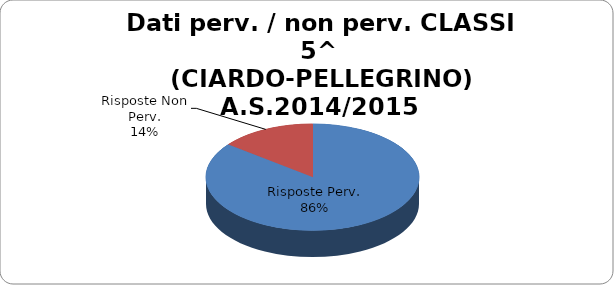
| Category | Series 0 | 85,53% 14,47% |
|---|---|---|
| 136.0 | 136 | 0.855 |
| 23.0 | 23 | 0.145 |